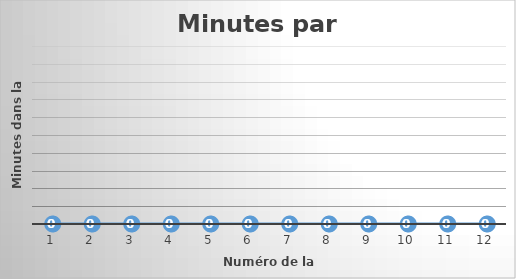
| Category | Minutes par semaine |
|---|---|
| 0 | 0 |
| 1 | 0 |
| 2 | 0 |
| 3 | 0 |
| 4 | 0 |
| 5 | 0 |
| 6 | 0 |
| 7 | 0 |
| 8 | 0 |
| 9 | 0 |
| 10 | 0 |
| 11 | 0 |